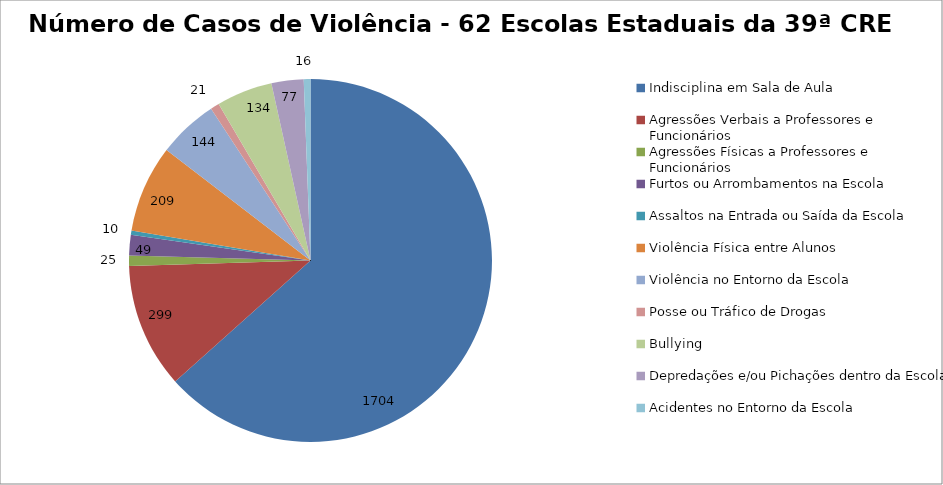
| Category | Número de Casos |
|---|---|
| Indisciplina em Sala de Aula | 1704 |
| Agressões Verbais a Professores e Funcionários | 299 |
| Agressões Físicas a Professores e Funcionários | 25 |
| Furtos ou Arrombamentos na Escola | 49 |
| Assaltos na Entrada ou Saída da Escola | 10 |
| Violência Física entre Alunos | 209 |
| Violência no Entorno da Escola | 144 |
| Posse ou Tráfico de Drogas | 21 |
| Bullying | 134 |
| Depredações e/ou Pichações dentro da Escola | 77 |
| Acidentes no Entorno da Escola | 16 |